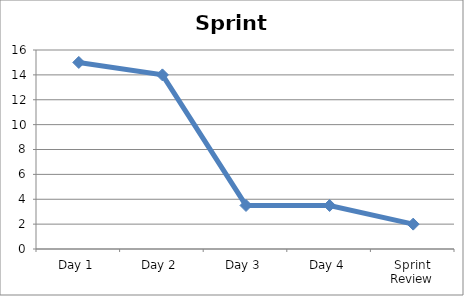
| Category | Series 0 |
|---|---|
| Day 1 | 15 |
| Day 2 | 14 |
| Day 3 | 3.5 |
| Day 4 | 3.5 |
| Sprint Review | 2 |